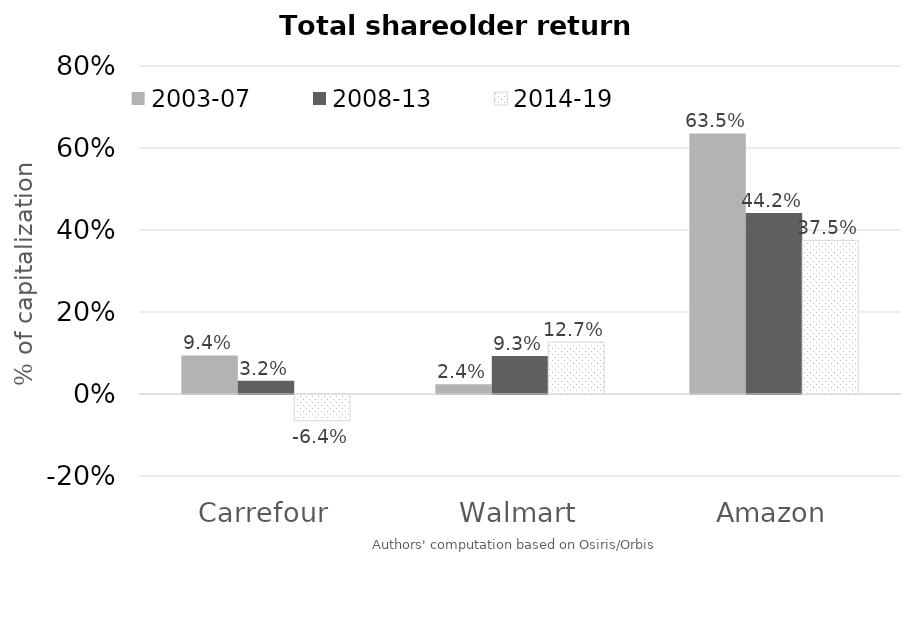
| Category | 2003-07 | 2008-13 | 2014-19 |
|---|---|---|---|
| Carrefour | 0.094 | 0.032 | -0.064 |
| Walmart | 0.024 | 0.093 | 0.127 |
| Amazon | 0.635 | 0.442 | 0.375 |